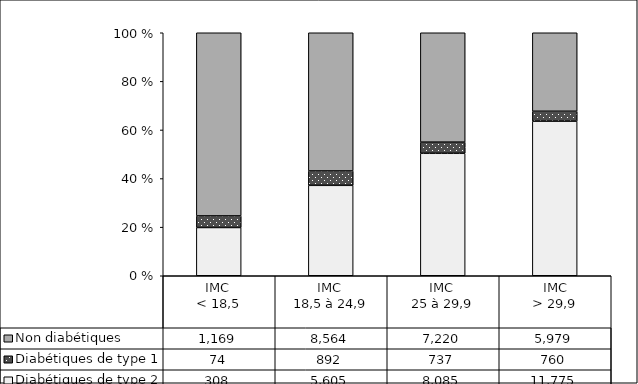
| Category | Diabétiques de type 2 | Diabétiques de type 1 | Non diabétiques |
|---|---|---|---|
| IMC 
< 18,5 | 308 | 74 | 1169 |
| IMC 
18,5 à 24,9 | 5605 | 892 | 8564 |
| IMC 
25 à 29,9 | 8085 | 737 | 7220 |
| IMC
> 29,9 | 11775 | 760 | 5979 |